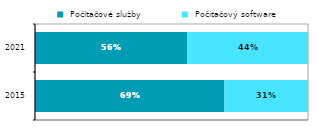
| Category |  Počítačové služby |  Počítačový software |
|---|---|---|
|  2015 | 0.694 | 0.306 |
| 2021 | 0.557 | 0.443 |